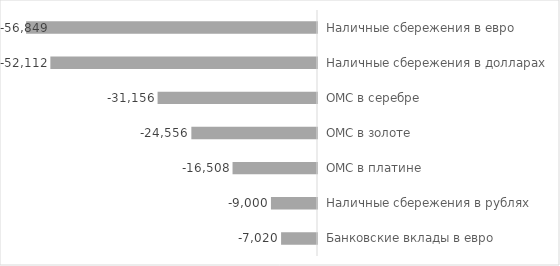
| Category | Реальная доходность, рублей |
|---|---|
| Банковские вклады в евро | -7020 |
| Наличные сбережения в рублях | -9000 |
| ОМС в платине | -16507.821 |
| ОМС в золоте | -24555.556 |
| ОМС в серебре | -31156.334 |
| Наличные сбережения в долларах | -52111.74 |
| Наличные сбережения в евро | -56849.329 |